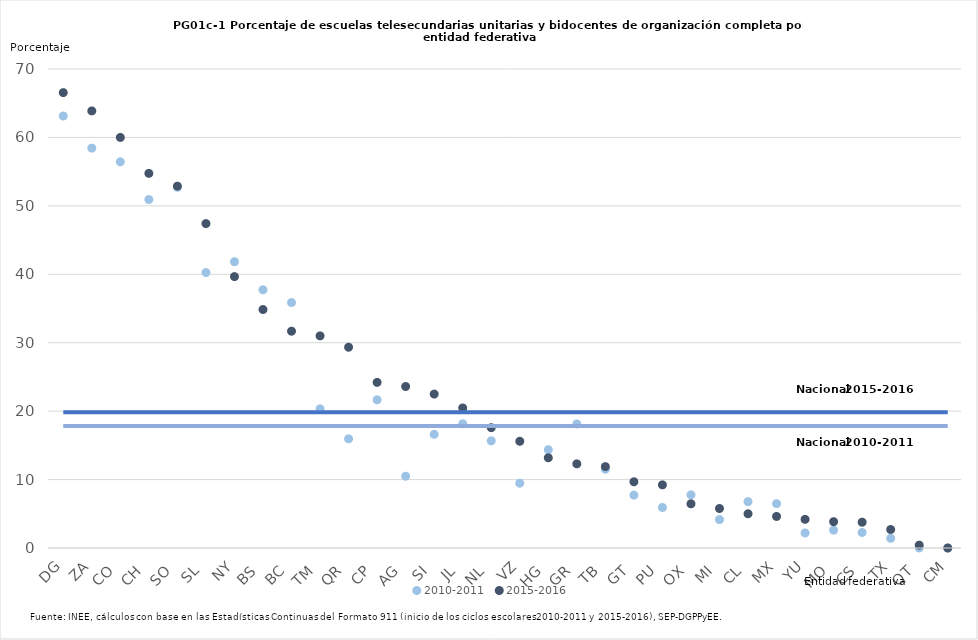
| Category | 2010-2011 | 2015-2016 | Series 2 | Series 3 |
|---|---|---|---|---|
| DG | 63.13 | 66.549 | 17.821 | 19.856 |
| ZA | 58.436 | 63.873 | 17.821 | 19.856 |
| CO | 56.436 | 60 | 17.821 | 19.856 |
| CH | 50.92 | 54.749 | 17.821 | 19.856 |
| SO | 52.721 | 52.881 | 17.821 | 19.856 |
| SL | 40.254 | 47.409 | 17.821 | 19.856 |
| NY | 41.837 | 39.661 | 17.821 | 19.856 |
| BS | 37.736 | 34.848 | 17.821 | 19.856 |
| BC | 35.87 | 31.683 | 17.821 | 19.856 |
| TM | 20.328 | 31 | 17.821 | 19.856 |
| QR | 15.951 | 29.341 | 17.821 | 19.856 |
| CP | 21.656 | 24.204 | 17.821 | 19.856 |
| AG | 10.494 | 23.602 | 17.821 | 19.856 |
| SI | 16.616 | 22.492 | 17.821 | 19.856 |
| JL | 18.153 | 20.465 | 17.821 | 19.856 |
| NL | 15.663 | 17.582 | 17.821 | 19.856 |
| VZ | 9.469 | 15.596 | 17.821 | 19.856 |
| HG | 14.36 | 13.185 | 17.821 | 19.856 |
| GR | 18.121 | 12.297 | 17.821 | 19.856 |
| TB | 11.504 | 11.894 | 17.821 | 19.856 |
| GT | 7.729 | 9.677 | 17.821 | 19.856 |
| PU | 5.921 | 9.226 | 17.821 | 19.856 |
| OX | 7.771 | 6.46 | 17.821 | 19.856 |
| MI | 4.147 | 5.773 | 17.821 | 19.856 |
| CL | 6.78 | 5 | 17.821 | 19.856 |
| MX | 6.483 | 4.611 | 17.821 | 19.856 |
| YU | 2.198 | 4.188 | 17.821 | 19.856 |
| MO | 2.614 | 3.846 | 17.821 | 19.856 |
| CS | 2.269 | 3.772 | 17.821 | 19.856 |
| TX | 1.418 | 2.703 | 17.821 | 19.856 |
| QT | 0 | 0.418 | 17.821 | 19.856 |
| CM | 0 | 0 | 17.821 | 19.856 |